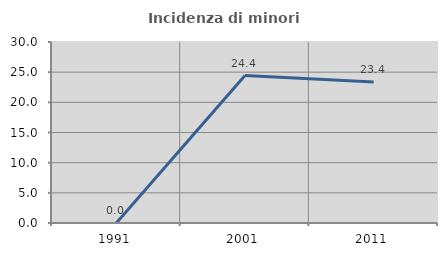
| Category | Incidenza di minori stranieri |
|---|---|
| 1991.0 | 0 |
| 2001.0 | 24.444 |
| 2011.0 | 23.355 |